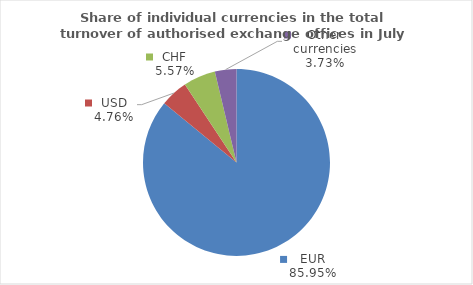
| Category | Series 0 |
|---|---|
| EUR | 85.943 |
| USD | 4.761 |
| CHF | 5.569 |
| Other currencies | 3.727 |